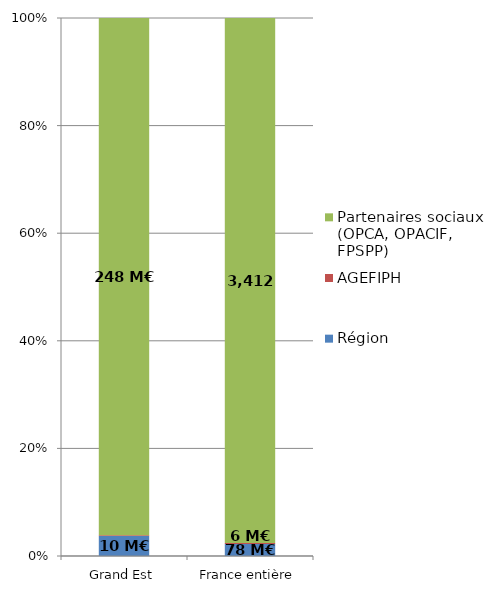
| Category | Région | AGEFIPH | Partenaires sociaux (OPCA, OPACIF, FPSPP) |
|---|---|---|---|
| Grand Est | 9.587 | 0.376 | 247.993 |
| France entière | 77.612 | 6.161 | 3411.683 |